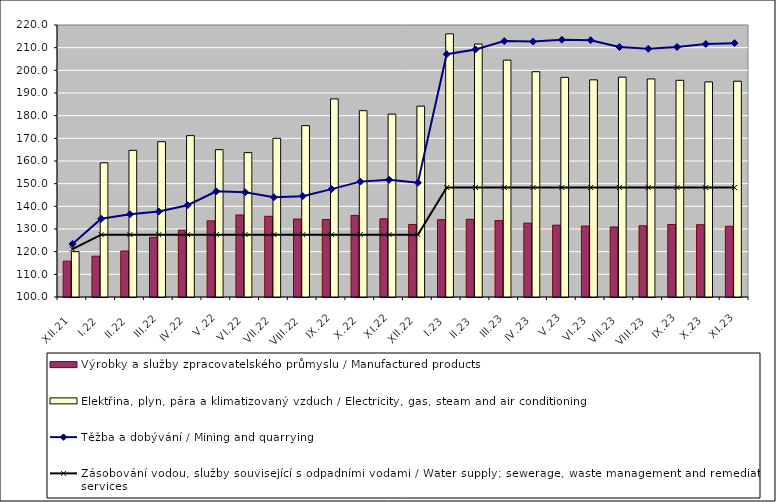
| Category | Výrobky a služby zpracovatelského průmyslu / Manufactured products | Elektřina, plyn, pára a klimatizovaný vzduch / Electricity, gas, steam and air conditioning |
|---|---|---|
| XII.21 | 115.8 | 120 |
| I.22 | 118 | 159.2 |
| II.22 | 120.3 | 164.7 |
| III.22 | 126.3 | 168.5 |
| IV.22 | 129.5 | 171.2 |
| V.22 | 133.6 | 165 |
| VI.22 | 136.2 | 163.7 |
| VII.22 | 135.6 | 170 |
| VIII.22 | 134.4 | 175.6 |
| IX.22 | 134.2 | 187.4 |
| X.22 | 136 | 182.2 |
| XI.22 | 134.5 | 180.7 |
| XII.22 | 132 | 184.2 |
| I.23 | 134.1 | 216.1 |
| II.23 | 134.3 | 211.6 |
| III.23 | 133.7 | 204.5 |
| IV.23 | 132.6 | 199.4 |
| V.23 | 131.7 | 196.9 |
| VI.23 | 131.3 | 195.8 |
| VII.23 | 130.9 | 197 |
| VIII.23 | 131.4 | 196.2 |
| IX.23 | 132 | 195.6 |
| X.23 | 131.9 | 194.9 |
| XI.23 | 131.2 | 195.2 |